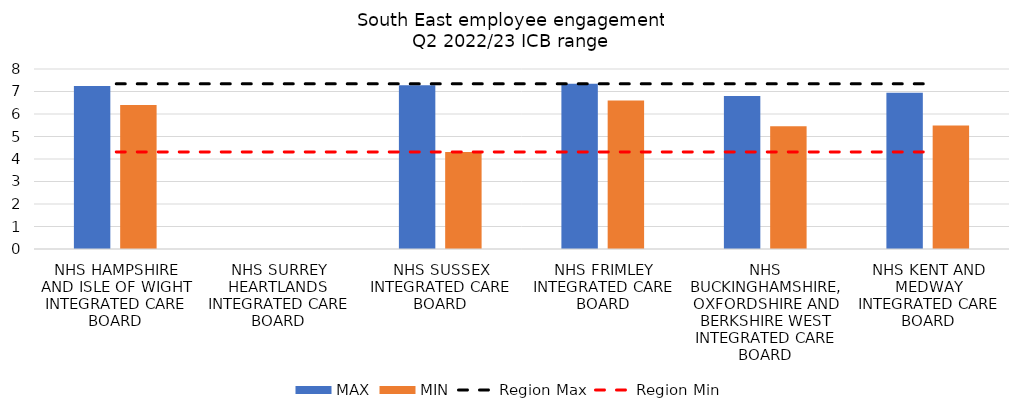
| Category | MAX | MIN |
|---|---|---|
| NHS HAMPSHIRE AND ISLE OF WIGHT INTEGRATED CARE BOARD | 7.243 | 6.396 |
| NHS SURREY HEARTLANDS INTEGRATED CARE BOARD | 0 | 0 |
| NHS SUSSEX INTEGRATED CARE BOARD | 7.278 | 4.314 |
| NHS FRIMLEY INTEGRATED CARE BOARD | 7.342 | 6.605 |
| NHS BUCKINGHAMSHIRE, OXFORDSHIRE AND BERKSHIRE WEST INTEGRATED CARE BOARD | 6.798 | 5.45 |
| NHS KENT AND MEDWAY INTEGRATED CARE BOARD | 6.943 | 5.488 |